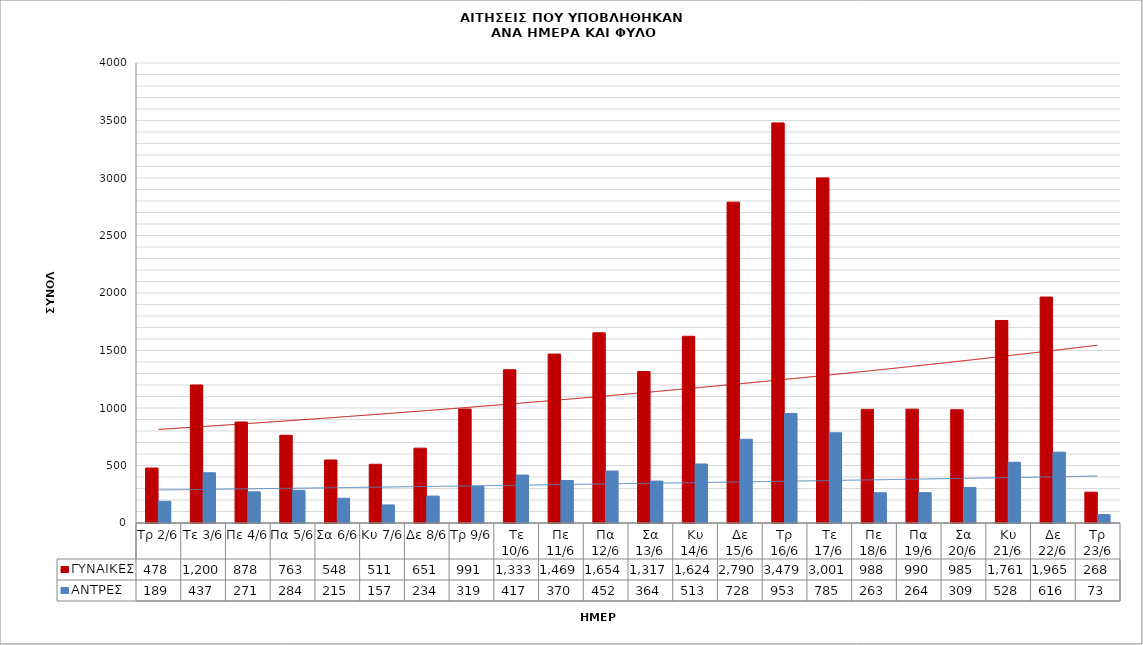
| Category | ΓΥΝΑΙΚΕΣ | ΑΝΤΡΕΣ |
|---|---|---|
| Τρ 2/6 | 478 | 189 |
| Τε 3/6 | 1200 | 437 |
| Πε 4/6 | 878 | 271 |
| Πα 5/6 | 763 | 284 |
| Σα 6/6 | 548 | 215 |
| Κυ 7/6 | 511 | 157 |
| Δε 8/6 | 651 | 234 |
| Τρ 9/6 | 991 | 319 |
| Τε 10/6 | 1333 | 417 |
| Πε 11/6 | 1469 | 370 |
| Πα 12/6 | 1654 | 452 |
| Σα 13/6 | 1317 | 364 |
| Κυ 14/6 | 1624 | 513 |
| Δε 15/6 | 2790 | 728 |
| Τρ 16/6 | 3479 | 953 |
| Τε 17/6 | 3001 | 785 |
| Πε 18/6 | 988 | 263 |
| Πα 19/6 | 990 | 264 |
| Σα 20/6 | 985 | 309 |
| Κυ 21/6 | 1761 | 528 |
| Δε 22/6 | 1965 | 616 |
| Τρ 23/6 | 268 | 73 |